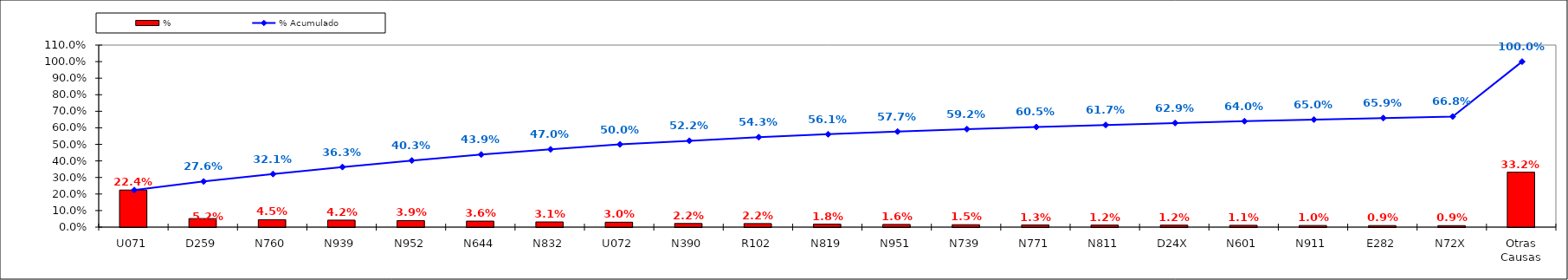
| Category | % |
|---|---|
| U071 | 0.224 |
| D259 | 0.052 |
| N760 | 0.045 |
| N939 | 0.042 |
| N952 | 0.039 |
| N644 | 0.036 |
| N832 | 0.031 |
| U072 | 0.03 |
| N390 | 0.022 |
| R102 | 0.022 |
| N819 | 0.018 |
| N951 | 0.016 |
| N739 | 0.015 |
| N771 | 0.013 |
| N811 | 0.012 |
| D24X | 0.012 |
| N601 | 0.011 |
| N911 | 0.01 |
| E282 | 0.009 |
| N72X | 0.009 |
| Otras Causas | 0.332 |